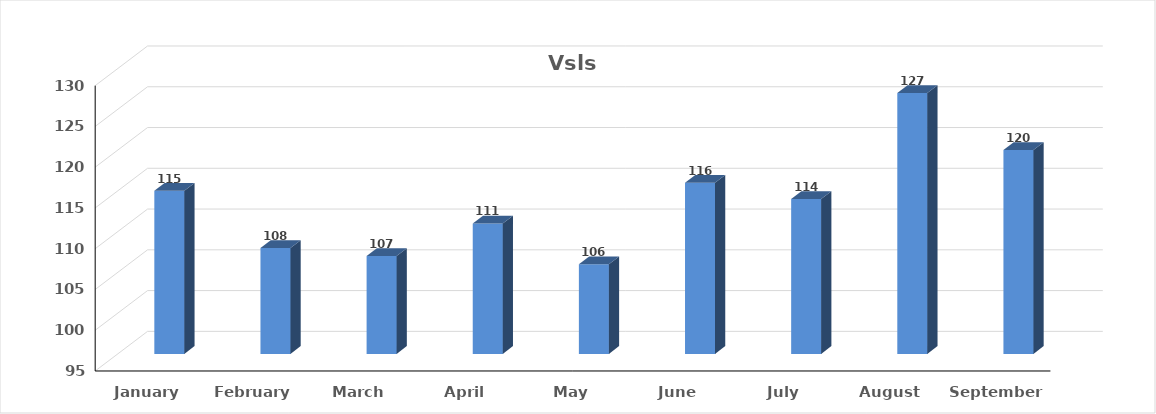
| Category | Vsls |
|---|---|
| January | 115 |
| February | 108 |
| March | 107 |
| April | 111 |
| May | 106 |
| June | 116 |
| July | 114 |
| August | 127 |
| September | 120 |